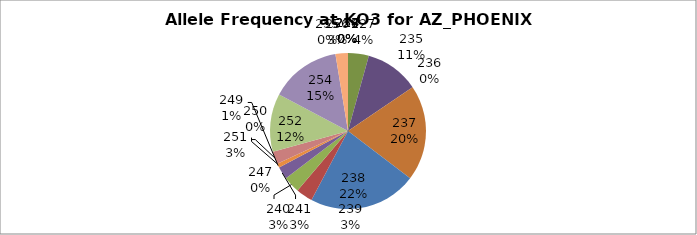
| Category | Series 0 |
|---|---|
| 218.0 | 0 |
| 224.0 | 0 |
| 227.0 | 0.043 |
| 235.0 | 0.112 |
| 236.0 | 0 |
| 237.0 | 0.198 |
| 238.0 | 0.224 |
| 239.0 | 0.034 |
| 240.0 | 0.034 |
| 241.0 | 0.026 |
| 247.0 | 0 |
| 249.0 | 0.009 |
| 250.0 | 0 |
| 251.0 | 0.026 |
| 252.0 | 0.121 |
| 254.0 | 0.147 |
| 255.0 | 0 |
| 256.0 | 0.026 |
| 257.0 | 0 |